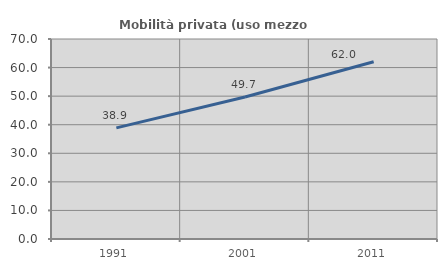
| Category | Mobilità privata (uso mezzo privato) |
|---|---|
| 1991.0 | 38.907 |
| 2001.0 | 49.7 |
| 2011.0 | 62.037 |